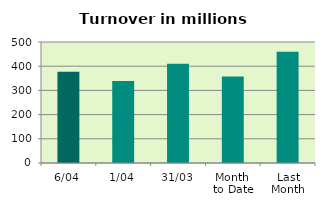
| Category | Series 0 |
|---|---|
| 6/04 | 376.896 |
| 1/04 | 338.788 |
| 31/03 | 410.538 |
| Month 
to Date | 357.842 |
| Last
Month | 459.546 |